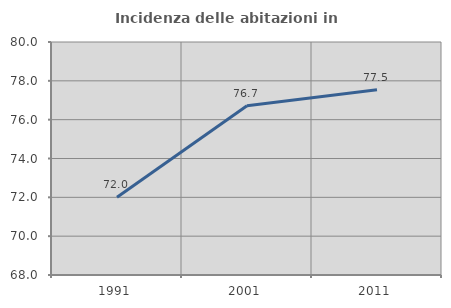
| Category | Incidenza delle abitazioni in proprietà  |
|---|---|
| 1991.0 | 72 |
| 2001.0 | 76.712 |
| 2011.0 | 77.538 |